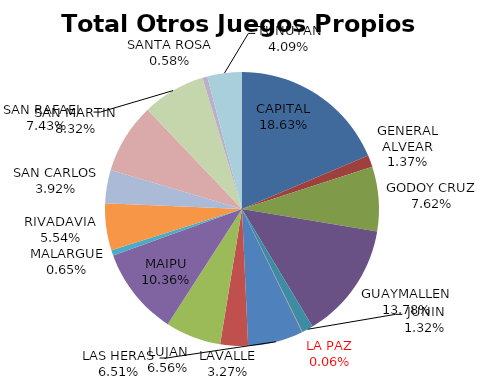
| Category | Total Otros Juegos Propios Beneficio |
|---|---|
| CAPITAL | 176868.5 |
| GENERAL ALVEAR | 13002.79 |
| GODOY CRUZ | 72326.04 |
| GUAYMALLEN | 130790.71 |
| JUNIN | 12509.93 |
| LA PAZ | -620.67 |
| LAS HERAS | 61785.65 |
| LAVALLE | 31040.27 |
| LUJAN | 62292.83 |
| MAIPU | 98380.36 |
| MALARGUE | 6134.9 |
| RIVADAVIA | 52601.56 |
| SAN CARLOS | 37217.9 |
| SAN MARTIN | 78948.72 |
| SAN RAFAEL  | 70495.3 |
| SANTA ROSA | 5550.7 |
| TUNUYAN | 38795.3 |